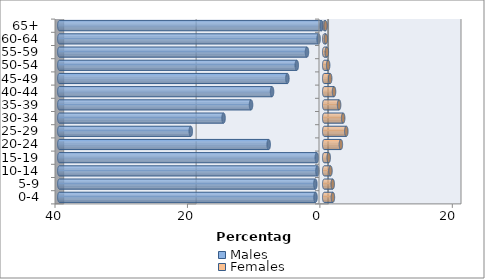
| Category | Males | Females |
|---|---|---|
| 0-4 | -1.316 | 1.31 |
| 5-9 | -1.338 | 1.28 |
| 10-14 | -1.026 | 0.942 |
| 15-19 | -1.118 | 0.678 |
| 20-24 | -8.385 | 2.514 |
| 25-29 | -20.152 | 3.336 |
| 30-34 | -15.202 | 2.861 |
| 35-39 | -11.052 | 2.244 |
| 40-44 | -7.878 | 1.48 |
| 45-49 | -5.56 | 0.898 |
| 50-54 | -4.145 | 0.595 |
| 55-59 | -2.606 | 0.394 |
| 60-64 | -0.851 | 0.25 |
| 65+ | -0.39 | 0.197 |